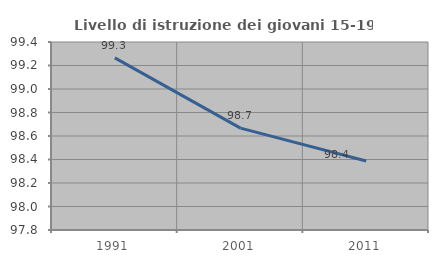
| Category | Livello di istruzione dei giovani 15-19 anni |
|---|---|
| 1991.0 | 99.265 |
| 2001.0 | 98.667 |
| 2011.0 | 98.387 |